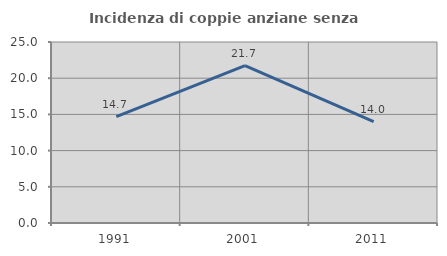
| Category | Incidenza di coppie anziane senza figli  |
|---|---|
| 1991.0 | 14.706 |
| 2001.0 | 21.739 |
| 2011.0 | 14 |